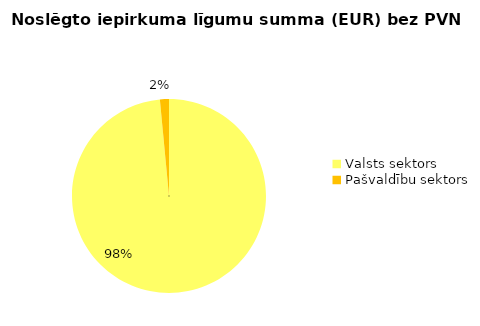
| Category | Noslēgto iepirkuma līgumu summa (EUR) bez PVN |
|---|---|
| Valsts sektors | 118058987 |
| Pašvaldību sektors | 1799546 |